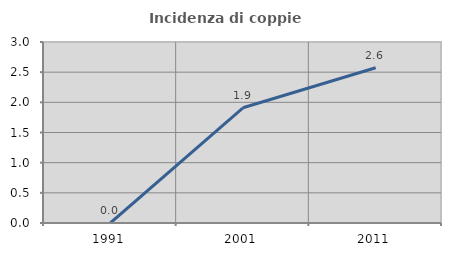
| Category | Incidenza di coppie miste |
|---|---|
| 1991.0 | 0 |
| 2001.0 | 1.909 |
| 2011.0 | 2.572 |